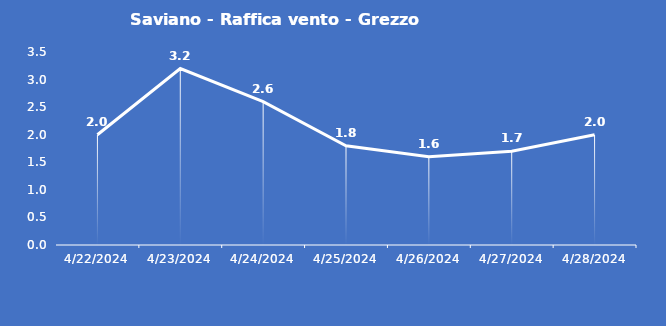
| Category | Saviano - Raffica vento - Grezzo (m/s) |
|---|---|
| 4/22/24 | 2 |
| 4/23/24 | 3.2 |
| 4/24/24 | 2.6 |
| 4/25/24 | 1.8 |
| 4/26/24 | 1.6 |
| 4/27/24 | 1.7 |
| 4/28/24 | 2 |